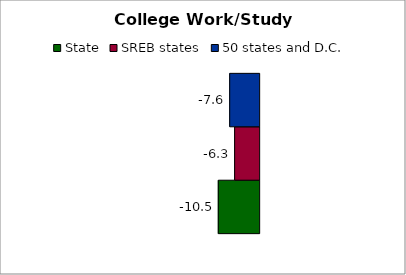
| Category | State | SREB states | 50 states and D.C. |
|---|---|---|---|
| 0 | -10.543 | -6.326 | -7.6 |